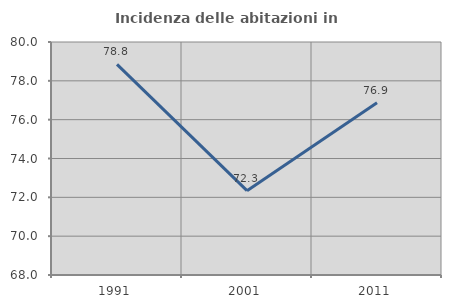
| Category | Incidenza delle abitazioni in proprietà  |
|---|---|
| 1991.0 | 78.846 |
| 2001.0 | 72.345 |
| 2011.0 | 76.872 |